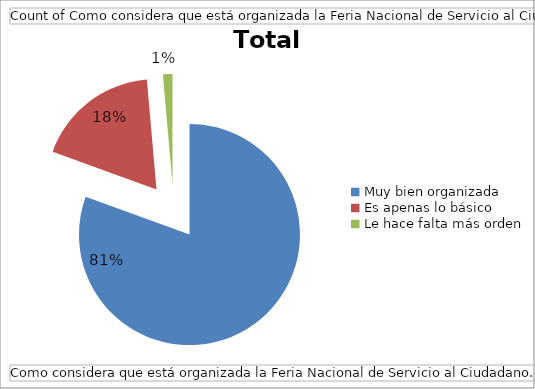
| Category | Total |
|---|---|
| Muy bien organizada | 174 |
| Es apenas lo básico | 39 |
| Le hace falta más orden | 3 |